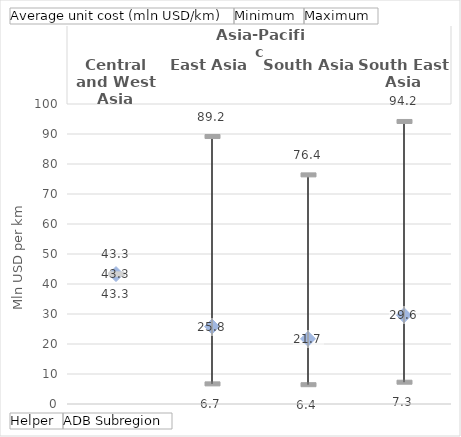
| Category | Average unit cost (mln USD/km) | Minimum | Maximum |
|---|---|---|---|
| 0 | 43.303 | 43.303 | 43.303 |
| 1 | 25.815 | 6.708 | 89.16 |
| 2 | 21.729 | 6.433 | 76.372 |
| 3 | 29.59 | 7.262 | 94.175 |